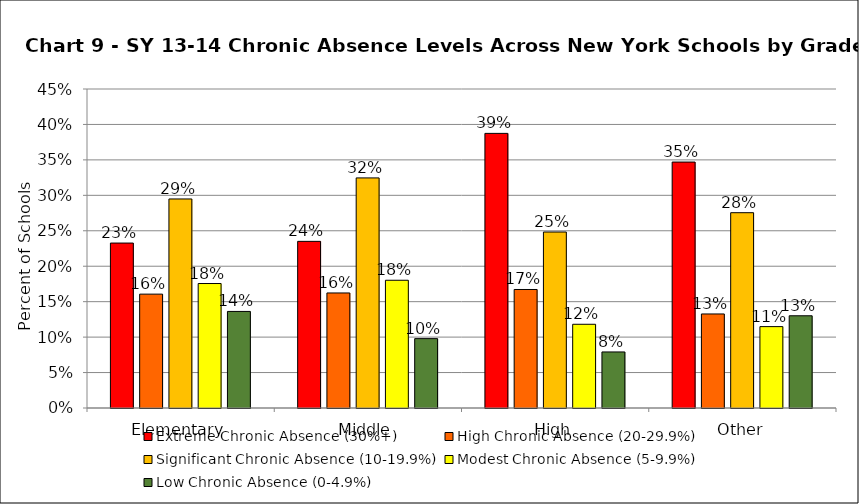
| Category | Extreme Chronic Absence (30%+) | High Chronic Absence (20-29.9%) | Significant Chronic Absence (10-19.9%) | Modest Chronic Absence (5-9.9%) | Low Chronic Absence (0-4.9%) |
|---|---|---|---|---|---|
| 0 | 0.233 | 0.161 | 0.295 | 0.176 | 0.136 |
| 1 | 0.235 | 0.162 | 0.325 | 0.18 | 0.098 |
| 2 | 0.387 | 0.167 | 0.248 | 0.118 | 0.079 |
| 3 | 0.347 | 0.133 | 0.276 | 0.115 | 0.13 |